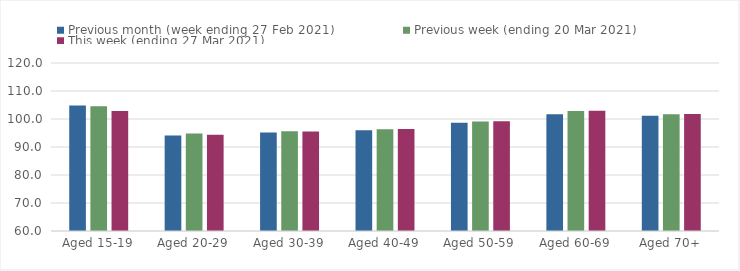
| Category | Previous month (week ending 27 Feb 2021) | Previous week (ending 20 Mar 2021) | This week (ending 27 Mar 2021) |
|---|---|---|---|
| Aged 15-19 | 104.84 | 104.56 | 102.84 |
| Aged 20-29 | 94.11 | 94.83 | 94.38 |
| Aged 30-39 | 95.15 | 95.59 | 95.55 |
| Aged 40-49 | 95.98 | 96.38 | 96.45 |
| Aged 50-59 | 98.64 | 99.07 | 99.2 |
| Aged 60-69 | 101.73 | 102.86 | 102.96 |
| Aged 70+ | 101.16 | 101.74 | 101.81 |